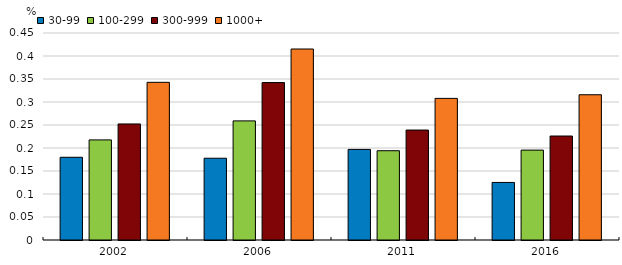
| Category | 30-99 | 100-299 | 300-999 | 1000+ |
|---|---|---|---|---|
| 2002.0 | 0.18 | 0.218 | 0.252 | 0.343 |
| 2006.0 | 0.178 | 0.259 | 0.342 | 0.415 |
| 2011.0 | 0.197 | 0.194 | 0.239 | 0.308 |
| 2016.0 | 0.125 | 0.195 | 0.226 | 0.316 |